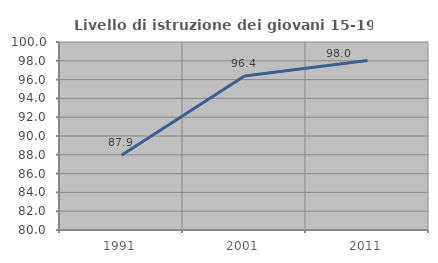
| Category | Livello di istruzione dei giovani 15-19 anni |
|---|---|
| 1991.0 | 87.943 |
| 2001.0 | 96.388 |
| 2011.0 | 98.025 |